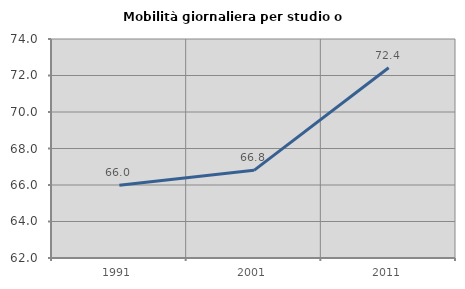
| Category | Mobilità giornaliera per studio o lavoro |
|---|---|
| 1991.0 | 65.985 |
| 2001.0 | 66.803 |
| 2011.0 | 72.421 |